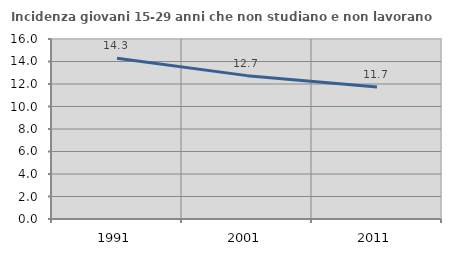
| Category | Incidenza giovani 15-29 anni che non studiano e non lavorano  |
|---|---|
| 1991.0 | 14.298 |
| 2001.0 | 12.744 |
| 2011.0 | 11.724 |